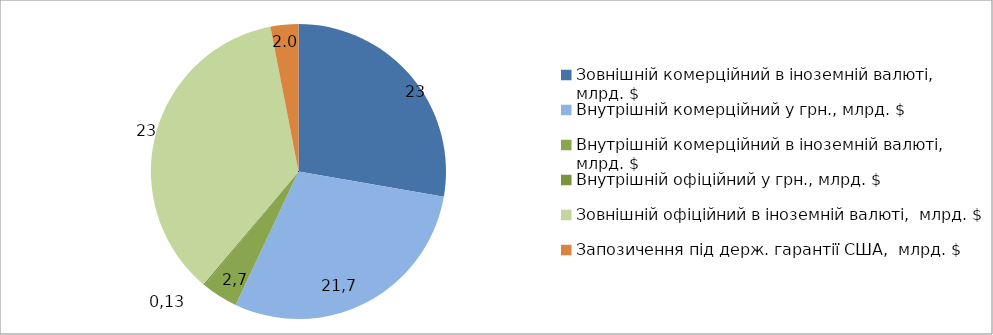
| Category | Series 0 |
|---|---|
| Зовнішній комерційний в іноземній валюті,  млрд. $ | 18.145 |
| Внутрішній комерційний у грн., млрд. $ | 19.144 |
| Внутрішній комерційний в іноземній валюті,  млрд. $ | 2.602 |
| Внутрішній офіційний у грн., млрд. $ | 0.105 |
| Зовнішній офіційний в іноземній валюті,  млрд. $ | 23.414 |
| Запозичення під держ. гарантії США,  млрд. $ | 2 |